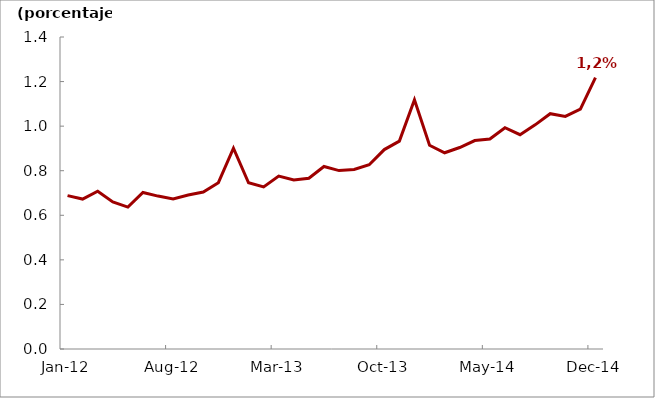
| Category | Series 0 |
|---|---|
| 2012-01-31 | 0.688 |
| 2012-02-29 | 0.673 |
| 2012-03-31 | 0.708 |
| 2012-04-30 | 0.66 |
| 2012-05-31 | 0.637 |
| 2012-06-30 | 0.702 |
| 2012-07-31 | 0.686 |
| 2012-08-31 | 0.674 |
| 2012-09-30 | 0.691 |
| 2012-10-31 | 0.704 |
| 2012-11-30 | 0.746 |
| 2012-12-31 | 0.901 |
| 2013-01-31 | 0.746 |
| 2013-02-28 | 0.727 |
| 2013-03-31 | 0.776 |
| 2013-04-30 | 0.758 |
| 2013-05-31 | 0.766 |
| 2013-06-30 | 0.819 |
| 2013-07-31 | 0.801 |
| 2013-08-31 | 0.805 |
| 2013-09-30 | 0.827 |
| 2013-10-31 | 0.895 |
| 2013-11-30 | 0.933 |
| 2013-12-31 | 1.118 |
| 2014-01-31 | 0.914 |
| 2014-02-28 | 0.881 |
| 2014-03-31 | 0.904 |
| 2014-04-30 | 0.935 |
| 2014-05-31 | 0.942 |
| 2014-06-30 | 0.993 |
| 2014-07-31 | 0.962 |
| 2014-08-31 | 1.006 |
| 2014-09-30 | 1.056 |
| 2014-10-31 | 1.044 |
| 2014-11-30 | 1.076 |
| 2014-12-31 | 1.218 |